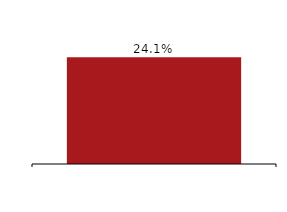
| Category | Total capital ratio |
|---|---|
|  | 0.241 |